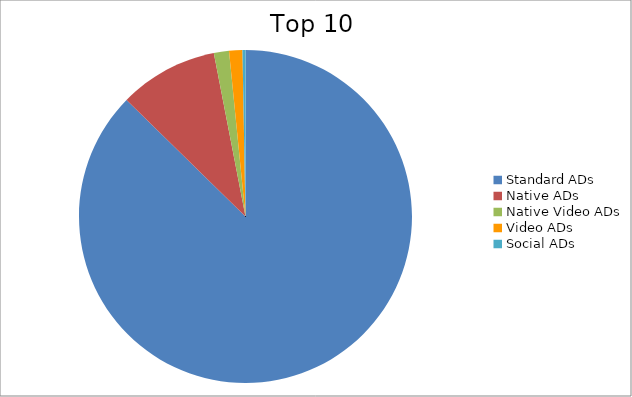
| Category | Series 0 |
|---|---|
| Standard ADs | 87.33 |
| Native ADs | 9.62 |
| Native Video ADs | 1.47 |
| Video ADs | 1.29 |
| Social ADs | 0.29 |